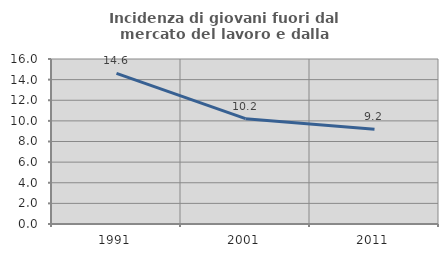
| Category | Incidenza di giovani fuori dal mercato del lavoro e dalla formazione  |
|---|---|
| 1991.0 | 14.601 |
| 2001.0 | 10.211 |
| 2011.0 | 9.179 |